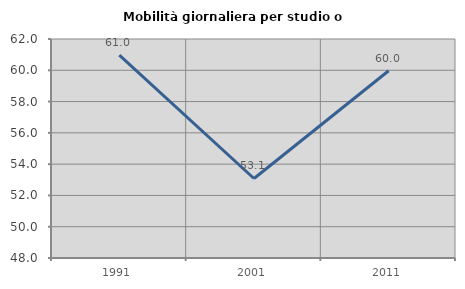
| Category | Mobilità giornaliera per studio o lavoro |
|---|---|
| 1991.0 | 60.973 |
| 2001.0 | 53.083 |
| 2011.0 | 59.971 |